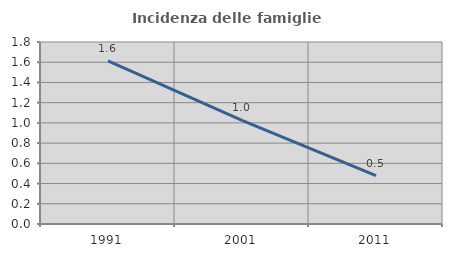
| Category | Incidenza delle famiglie numerose |
|---|---|
| 1991.0 | 1.613 |
| 2001.0 | 1.026 |
| 2011.0 | 0.478 |